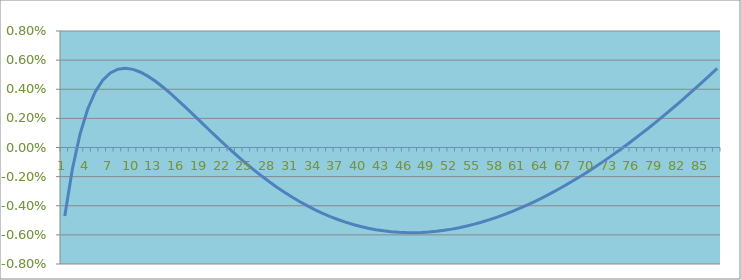
| Category | Series 0 |
|---|---|
| 0 | -0.005 |
| 1 | -0.001 |
| 2 | 0.001 |
| 3 | 0.003 |
| 4 | 0.004 |
| 5 | 0.005 |
| 6 | 0.005 |
| 7 | 0.005 |
| 8 | 0.005 |
| 9 | 0.005 |
| 10 | 0.005 |
| 11 | 0.005 |
| 12 | 0.005 |
| 13 | 0.004 |
| 14 | 0.004 |
| 15 | 0.003 |
| 16 | 0.003 |
| 17 | 0.002 |
| 18 | 0.002 |
| 19 | 0.001 |
| 20 | 0.001 |
| 21 | 0 |
| 22 | 0 |
| 23 | -0.001 |
| 24 | -0.001 |
| 25 | -0.002 |
| 26 | -0.002 |
| 27 | -0.002 |
| 28 | -0.003 |
| 29 | -0.003 |
| 30 | -0.003 |
| 31 | -0.004 |
| 32 | -0.004 |
| 33 | -0.004 |
| 34 | -0.005 |
| 35 | -0.005 |
| 36 | -0.005 |
| 37 | -0.005 |
| 38 | -0.005 |
| 39 | -0.005 |
| 40 | -0.006 |
| 41 | -0.006 |
| 42 | -0.006 |
| 43 | -0.006 |
| 44 | -0.006 |
| 45 | -0.006 |
| 46 | -0.006 |
| 47 | -0.006 |
| 48 | -0.006 |
| 49 | -0.006 |
| 50 | -0.006 |
| 51 | -0.006 |
| 52 | -0.006 |
| 53 | -0.005 |
| 54 | -0.005 |
| 55 | -0.005 |
| 56 | -0.005 |
| 57 | -0.005 |
| 58 | -0.005 |
| 59 | -0.004 |
| 60 | -0.004 |
| 61 | -0.004 |
| 62 | -0.004 |
| 63 | -0.003 |
| 64 | -0.003 |
| 65 | -0.003 |
| 66 | -0.003 |
| 67 | -0.002 |
| 68 | -0.002 |
| 69 | -0.002 |
| 70 | -0.001 |
| 71 | -0.001 |
| 72 | -0.001 |
| 73 | 0 |
| 74 | 0 |
| 75 | 0.001 |
| 76 | 0.001 |
| 77 | 0.001 |
| 78 | 0.002 |
| 79 | 0.002 |
| 80 | 0.003 |
| 81 | 0.003 |
| 82 | 0.004 |
| 83 | 0.004 |
| 84 | 0.004 |
| 85 | 0.005 |
| 86 | 0.005 |